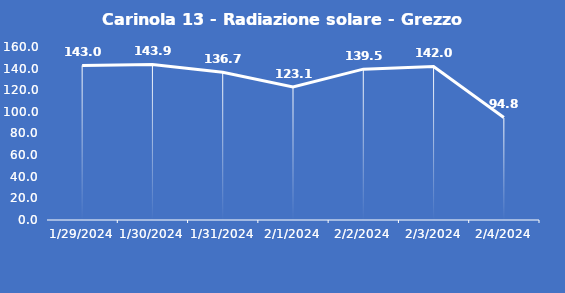
| Category | Carinola 13 - Radiazione solare - Grezzo (W/m2) |
|---|---|
| 1/29/24 | 143 |
| 1/30/24 | 143.9 |
| 1/31/24 | 136.7 |
| 2/1/24 | 123.1 |
| 2/2/24 | 139.5 |
| 2/3/24 | 142 |
| 2/4/24 | 94.8 |